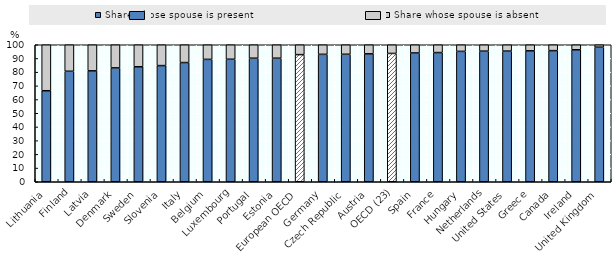
| Category | Share whose spouse is present | Share whose spouse is absent |
|---|---|---|
| Lithuania | 66.44 | 33.56 |
| Finland | 80.648 | 19.352 |
| Latvia | 80.96 | 19.04 |
| Denmark | 83.112 | 16.888 |
| Sweden | 83.933 | 16.067 |
| Slovenia | 84.796 | 15.204 |
| Italy | 87.02 | 12.98 |
| Belgium | 89.333 | 10.667 |
| Luxembourg | 89.419 | 10.581 |
| Portugal | 90.187 | 9.813 |
| Estonia | 90.189 | 9.811 |
| European OECD | 92.803 | 7.197 |
| Germany | 93.011 | 6.989 |
| Czech Republic | 93.059 | 6.941 |
| Austria | 93.367 | 6.633 |
| OECD (23) | 93.66 | 6.34 |
| Spain | 94.001 | 5.999 |
| France | 94.302 | 5.698 |
| Hungary | 95.175 | 4.825 |
| Netherlands | 95.328 | 4.672 |
| United States | 95.364 | 4.636 |
| Greece | 95.561 | 4.439 |
| Canada | 95.716 | 4.284 |
| Ireland | 96.327 | 3.673 |
| United Kingdom | 98.242 | 1.758 |